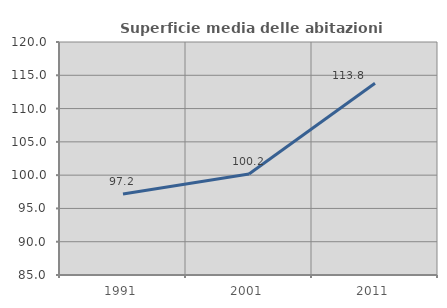
| Category | Superficie media delle abitazioni occupate |
|---|---|
| 1991.0 | 97.152 |
| 2001.0 | 100.177 |
| 2011.0 | 113.809 |